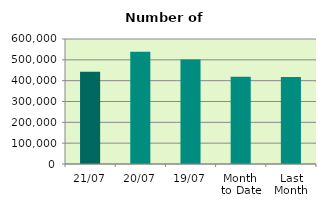
| Category | Series 0 |
|---|---|
| 21/07 | 442492 |
| 20/07 | 538434 |
| 19/07 | 501534 |
| Month 
to Date | 418950.8 |
| Last
Month | 418146.182 |